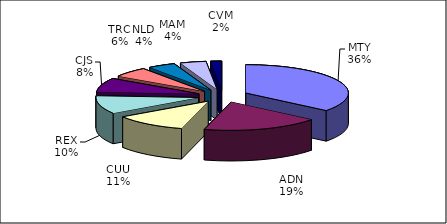
| Category | Series 0 |
|---|---|
| MTY | 96766 |
| ADN | 50311 |
| CUU | 31207 |
| REX | 28024 |
| CJS | 21971 |
| TRC | 15564 |
| NLD | 11768 |
| MAM | 11105 |
| CVM | 4683 |